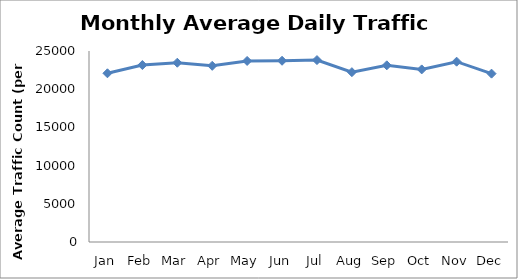
| Category | Series 0 |
|---|---|
| Jan | 22082.75 |
| Feb | 23162.25 |
| Mar | 23464.25 |
| Apr | 23060 |
| May | 23697.5 |
| Jun | 23723.25 |
| Jul | 23812.25 |
| Aug | 22230.5 |
| Sep | 23125.5 |
| Oct | 22589.5 |
| Nov | 23601.5 |
| Dec | 22035.75 |